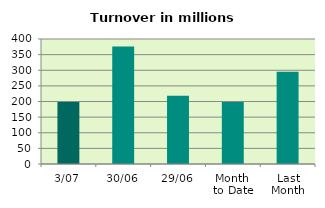
| Category | Series 0 |
|---|---|
| 3/07 | 198.029 |
| 30/06 | 375.837 |
| 29/06 | 218.463 |
| Month 
to Date | 198.029 |
| Last
Month | 295.453 |